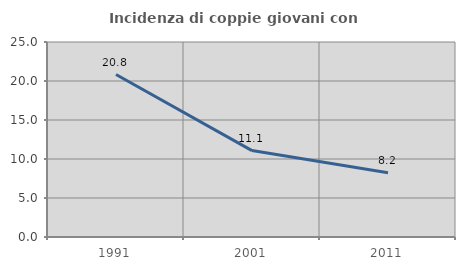
| Category | Incidenza di coppie giovani con figli |
|---|---|
| 1991.0 | 20.827 |
| 2001.0 | 11.08 |
| 2011.0 | 8.228 |